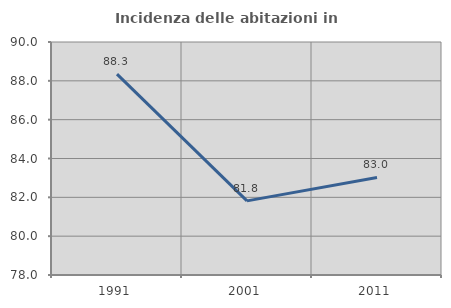
| Category | Incidenza delle abitazioni in proprietà  |
|---|---|
| 1991.0 | 88.347 |
| 2001.0 | 81.818 |
| 2011.0 | 83.024 |